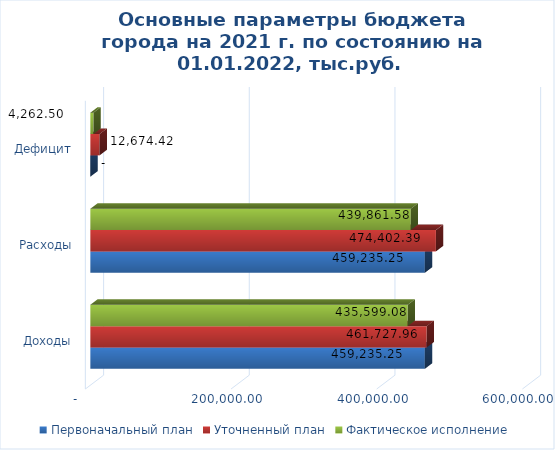
| Category | Первоначальный план | Уточненный план | Фактическое исполнение |
|---|---|---|---|
| Доходы | 459235.253 | 461727.964 | 435599.076 |
| Расходы | 459235.253 | 474402.386 | 439861.58 |
| Дефицит | 0 | 12674.422 | 4262.504 |